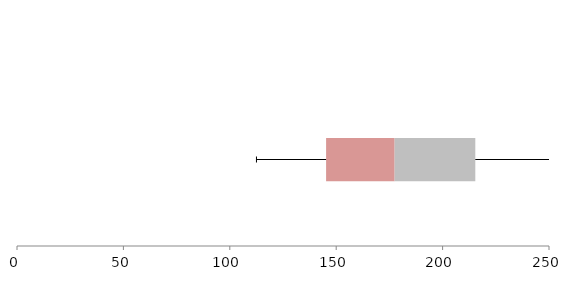
| Category | Series 1 | Series 2 | Series 3 |
|---|---|---|---|
| 0 | 145.254 | 32.207 | 37.912 |